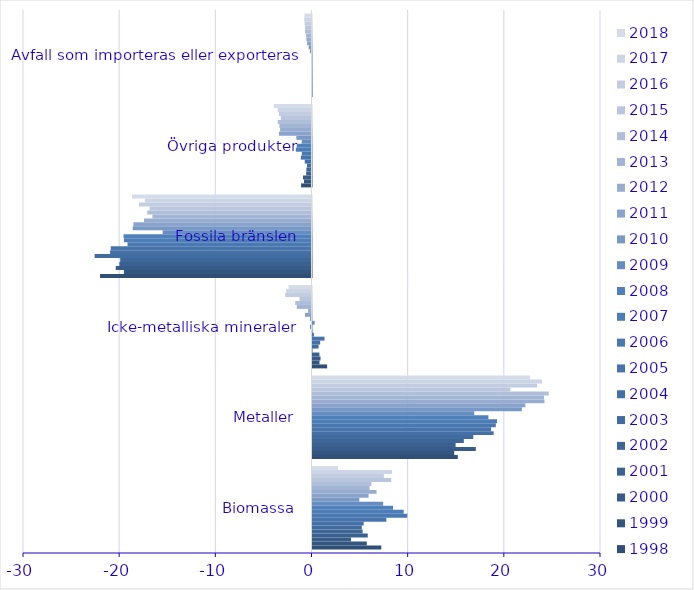
| Category | 1998 | 1999 | 2000 | 2001 | 2002 | 2003 | 2004 | 2005 | 2006 | 2007 | 2008 | 2009 | 2010 | 2011 | 2012 | 2013 | 2014 | 2015 | 2016 | 2017 | 2018 |
|---|---|---|---|---|---|---|---|---|---|---|---|---|---|---|---|---|---|---|---|---|---|
| Biomassa | 7.155 | 5.646 | 4.006 | 5.745 | 5.214 | 5.129 | 5.324 | 7.68 | 9.854 | 9.479 | 8.37 | 7.344 | 4.868 | 5.828 | 6.657 | 5.93 | 6.124 | 8.178 | 7.418 | 8.266 | 2.651 |
| Metaller | 15.11 | 14.74 | 16.983 | 14.88 | 15.735 | 16.716 | 18.835 | 18.572 | 19.062 | 19.19 | 18.291 | 16.819 | 21.769 | 22.139 | 24.122 | 24.076 | 24.563 | 20.564 | 23.355 | 23.862 | 22.627 |
| Icke-metalliska mineraler | 1.521 | 0.726 | 0.835 | 0.719 | -0.034 | 0.636 | 0.795 | 1.249 | 0.15 | 0.005 | -0.148 | 0.223 | -0.152 | -0.679 | -0.36 | -1.529 | -1.692 | -1.239 | -2.738 | -2.63 | -2.386 |
| Fossila bränslen | -21.988 | -19.506 | -20.354 | -19.978 | -19.893 | -22.552 | -20.945 | -20.876 | -19.131 | -19.5 | -19.543 | -15.474 | -18.591 | -18.518 | -17.422 | -16.543 | -17.077 | -16.83 | -17.935 | -17.319 | -18.668 |
| Övriga produkter | -1.083 | -0.784 | -0.882 | -0.553 | -0.531 | -0.472 | -0.702 | -1.108 | -1.006 | -1.629 | -1.537 | -1.024 | -1.573 | -3.384 | -3.263 | -3.334 | -3.507 | -3.187 | -3.379 | -3.511 | -3.934 |
| Avfall som importeras eller exporteras | 0 | 0 | 0 | 0 | -0.002 | -0.002 | -0.002 | -0.017 | -0.008 | -0.013 | -0.027 | -0.156 | -0.29 | -0.46 | -0.534 | -0.56 | -0.667 | -0.671 | -0.712 | -0.756 | -0.737 |